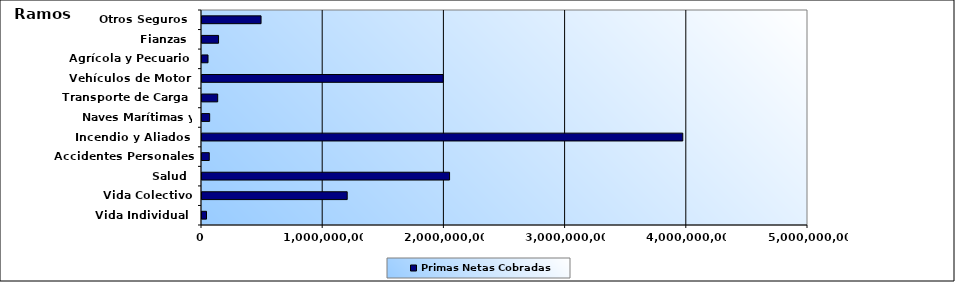
| Category | Primas Netas Cobradas |
|---|---|
| Vida Individual  | 37203140.62 |
| Vida Colectivo | 1198107695.74 |
| Salud  | 2042639087.51 |
| Accidentes Personales | 59999999.46 |
| Incendio y Aliados  | 3966846365.97 |
| Naves Marítimas y Aéreas  | 63270778.34 |
| Transporte de Carga  | 129555027.95 |
| Vehículos de Motor  | 1990070624.32 |
| Agrícola y Pecuario  | 49725959.15 |
| Fianzas  | 136528588.48 |
| Otros Seguros  | 487236121.54 |